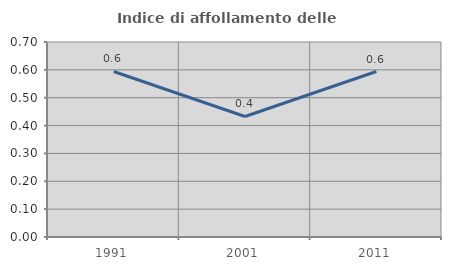
| Category | Indice di affollamento delle abitazioni  |
|---|---|
| 1991.0 | 0.594 |
| 2001.0 | 0.433 |
| 2011.0 | 0.594 |